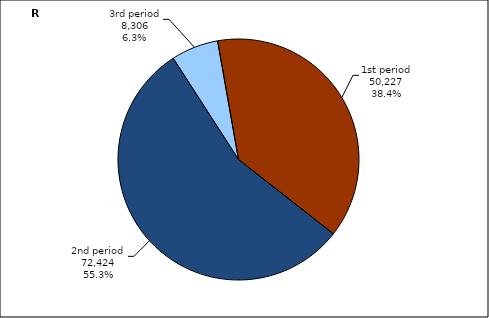
| Category | Series 3 |
|---|---|
| 1st period | 50227.182 |
| 2nd period | 72423.655 |
| 3rd period | 8306.206 |